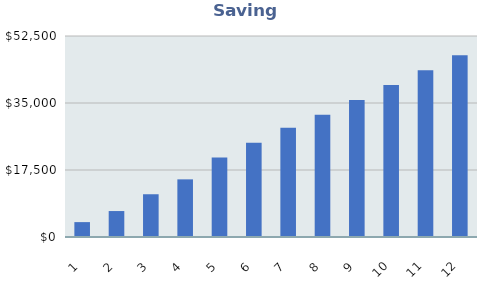
| Category | Series 0 |
|---|---|
| 0 | 3889 |
| 1 | 6778 |
| 2 | 11167 |
| 3 | 15056 |
| 4 | 20745 |
| 5 | 24634 |
| 6 | 28523 |
| 7 | 31912 |
| 8 | 35801 |
| 9 | 39690 |
| 10 | 43579 |
| 11 | 47468 |